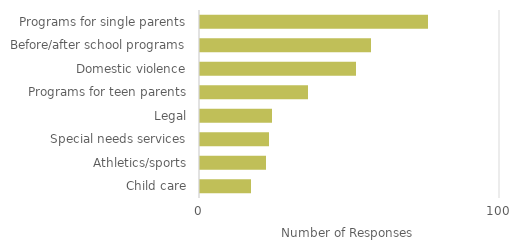
| Category | More services needed |
|---|---|
| Child care | 17 |
| Athletics/sports | 22 |
| Special needs services | 23 |
| Legal | 24 |
| Programs for teen parents | 36 |
| Domestic violence | 52 |
| Before/after school programs | 57 |
| Programs for single parents | 76 |